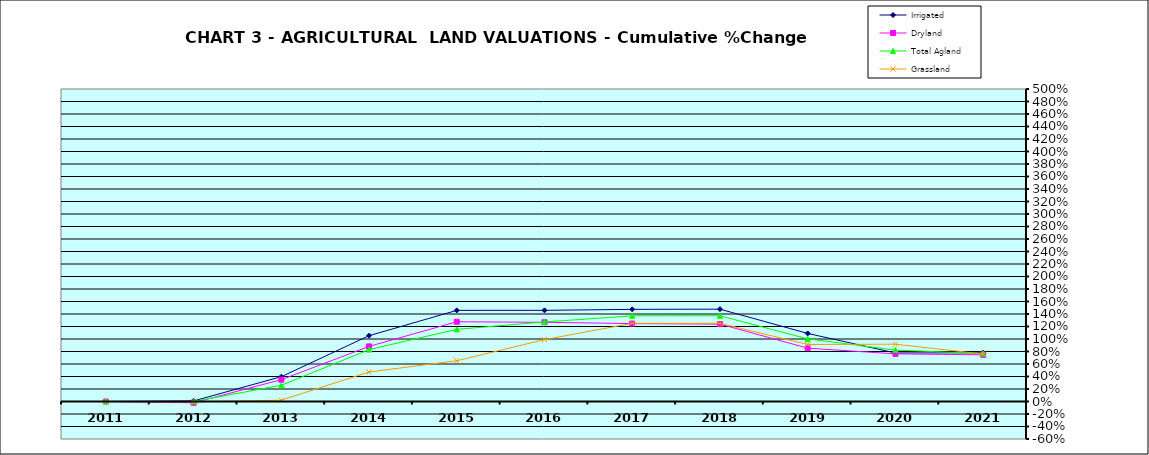
| Category | Irrigated | Dryland | Total Agland | Grassland |
|---|---|---|---|---|
| 2011.0 | 0 | 0 | 0 | 0 |
| 2012.0 | 0.009 | -0.02 | 0.001 | -0.007 |
| 2013.0 | 0.397 | 0.349 | 0.26 | 0.022 |
| 2014.0 | 1.053 | 0.881 | 0.83 | 0.472 |
| 2015.0 | 1.458 | 1.276 | 1.154 | 0.652 |
| 2016.0 | 1.458 | 1.267 | 1.272 | 0.99 |
| 2017.0 | 1.474 | 1.247 | 1.371 | 1.251 |
| 2018.0 | 1.477 | 1.238 | 1.371 | 1.25 |
| 2019.0 | 1.089 | 0.853 | 1.003 | 0.912 |
| 2020.0 | 0.776 | 0.762 | 0.822 | 0.917 |
| 2021.0 | 0.779 | 0.747 | 0.767 | 0.76 |